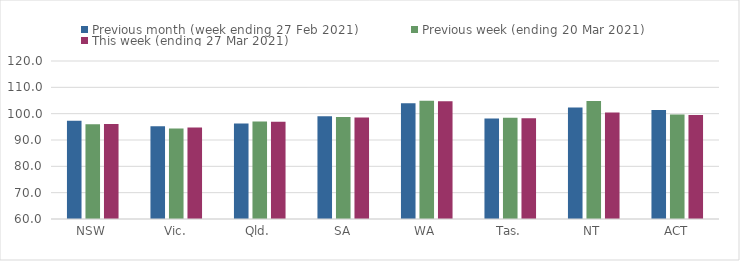
| Category | Previous month (week ending 27 Feb 2021) | Previous week (ending 20 Mar 2021) | This week (ending 27 Mar 2021) |
|---|---|---|---|
| NSW | 97.31 | 95.98 | 96.1 |
| Vic. | 95.26 | 94.41 | 94.78 |
| Qld. | 96.26 | 96.99 | 96.89 |
| SA | 98.99 | 98.75 | 98.53 |
| WA | 103.92 | 104.93 | 104.71 |
| Tas. | 98.19 | 98.47 | 98.22 |
| NT | 102.3 | 104.77 | 100.46 |
| ACT | 101.42 | 99.66 | 99.49 |